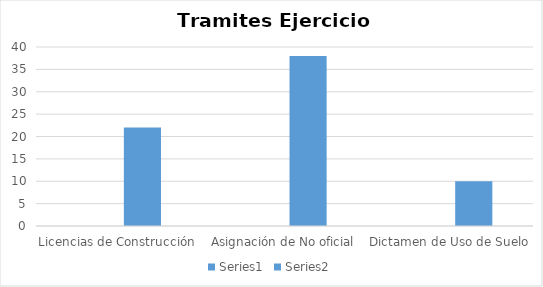
| Category | Series 0 | Series 1 |
|---|---|---|
| Licencias de Construcción |  | 22 |
| Asignación de No oficial |  | 38 |
| Dictamen de Uso de Suelo |  | 10 |